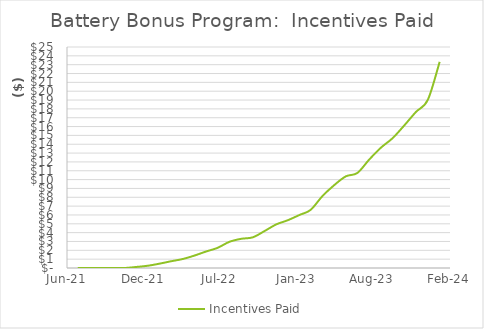
| Category | Incentives Paid |
|---|---|
| 44378.0 | 0 |
| 44409.0 | 0 |
| 44440.0 | 0 |
| 44470.0 | 0 |
| 44501.0 | 0 |
| 44531.0 | 118150 |
| 44562.0 | 261800 |
| 44593.0 | 502554 |
| 44621.0 | 756815 |
| 44652.0 | 1014263 |
| 44682.0 | 1395029 |
| 44713.0 | 1864535 |
| 44743.0 | 2277550 |
| 44774.0 | 2960814 |
| 44805.0 | 3304214 |
| 44835.0 | 3468009 |
| 44866.0 | 4185426 |
| 44896.0 | 4925374 |
| 44927.0 | 5413693 |
| 44958.0 | 6017856 |
| 44986.0 | 6572178 |
| 45017.0 | 8136532 |
| 45047.0 | 9348071 |
| 45078.0 | 10367501 |
| 45108.0 | 10746023 |
| 45139.0 | 12262993 |
| 45170.0 | 13624565 |
| 45200.0 | 14680503 |
| 45231.0 | 16146940 |
| 45261.0 | 17652231 |
| 45292.0 | 19017705 |
| 45323.0 | 23318611 |